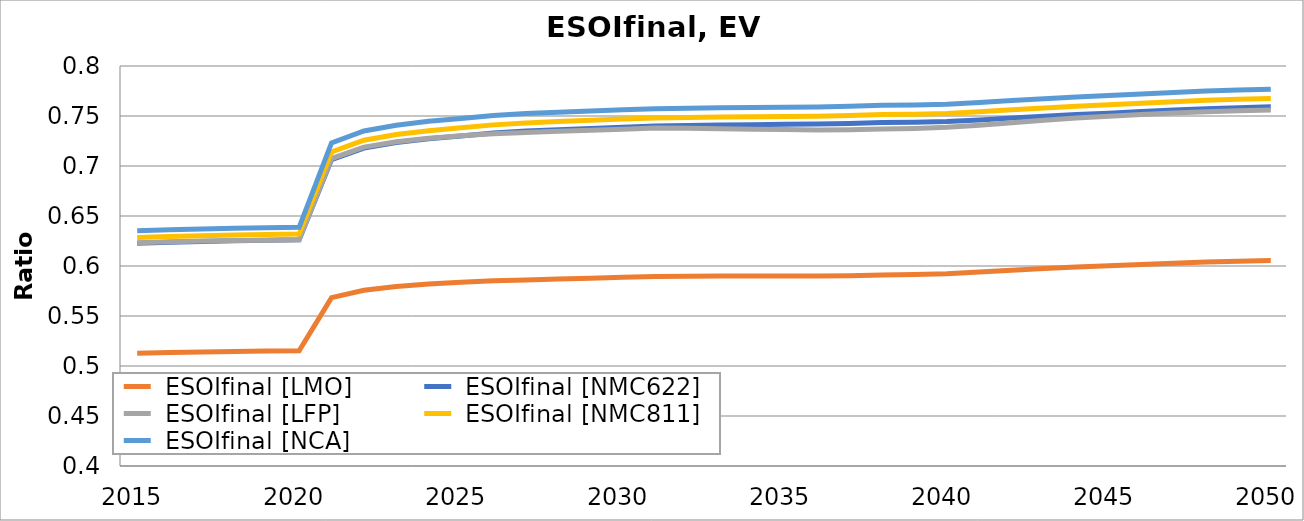
| Category |  ESOIfinal [LMO] |  ESOIfinal [NMC622] |  ESOIfinal [LFP] |  ESOIfinal [NMC811] |  ESOIfinal [NCA] |
|---|---|---|---|---|---|
| 2015.0 | 0.513 | 0.623 | 0.623 | 0.628 | 0.635 |
| 2016.0 | 0.513 | 0.624 | 0.624 | 0.629 | 0.636 |
| 2017.0 | 0.514 | 0.625 | 0.625 | 0.63 | 0.637 |
| 2018.0 | 0.515 | 0.625 | 0.625 | 0.631 | 0.638 |
| 2019.0 | 0.515 | 0.626 | 0.626 | 0.632 | 0.638 |
| 2020.0 | 0.515 | 0.626 | 0.626 | 0.632 | 0.639 |
| 2021.0 | 0.568 | 0.706 | 0.707 | 0.714 | 0.723 |
| 2022.0 | 0.576 | 0.718 | 0.719 | 0.726 | 0.735 |
| 2023.0 | 0.579 | 0.723 | 0.724 | 0.731 | 0.741 |
| 2024.0 | 0.582 | 0.727 | 0.728 | 0.735 | 0.745 |
| 2025.0 | 0.584 | 0.73 | 0.73 | 0.738 | 0.748 |
| 2026.0 | 0.585 | 0.733 | 0.732 | 0.741 | 0.751 |
| 2027.0 | 0.586 | 0.735 | 0.734 | 0.743 | 0.752 |
| 2028.0 | 0.587 | 0.736 | 0.735 | 0.744 | 0.754 |
| 2029.0 | 0.588 | 0.738 | 0.736 | 0.746 | 0.755 |
| 2030.0 | 0.589 | 0.739 | 0.737 | 0.747 | 0.756 |
| 2031.0 | 0.59 | 0.74 | 0.738 | 0.748 | 0.757 |
| 2032.0 | 0.59 | 0.74 | 0.738 | 0.749 | 0.758 |
| 2033.0 | 0.59 | 0.741 | 0.737 | 0.749 | 0.758 |
| 2034.0 | 0.59 | 0.741 | 0.737 | 0.749 | 0.759 |
| 2035.0 | 0.59 | 0.742 | 0.736 | 0.75 | 0.759 |
| 2036.0 | 0.59 | 0.742 | 0.736 | 0.75 | 0.759 |
| 2037.0 | 0.59 | 0.743 | 0.736 | 0.751 | 0.76 |
| 2038.0 | 0.591 | 0.743 | 0.737 | 0.751 | 0.761 |
| 2039.0 | 0.591 | 0.744 | 0.738 | 0.752 | 0.761 |
| 2040.0 | 0.592 | 0.744 | 0.739 | 0.753 | 0.762 |
| 2041.0 | 0.594 | 0.746 | 0.741 | 0.754 | 0.763 |
| 2042.0 | 0.596 | 0.748 | 0.743 | 0.756 | 0.765 |
| 2043.0 | 0.598 | 0.75 | 0.746 | 0.758 | 0.767 |
| 2044.0 | 0.599 | 0.752 | 0.748 | 0.76 | 0.769 |
| 2045.0 | 0.6 | 0.753 | 0.75 | 0.761 | 0.77 |
| 2046.0 | 0.602 | 0.754 | 0.752 | 0.763 | 0.772 |
| 2047.0 | 0.603 | 0.756 | 0.753 | 0.764 | 0.774 |
| 2048.0 | 0.604 | 0.757 | 0.754 | 0.766 | 0.775 |
| 2049.0 | 0.605 | 0.758 | 0.755 | 0.767 | 0.776 |
| 2050.0 | 0.605 | 0.759 | 0.756 | 0.768 | 0.777 |